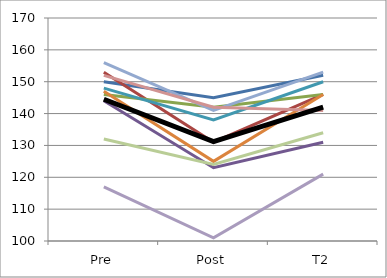
| Category | Series 0 | Series 1 | Series 2 | Series 3 | Series 4 | Series 5 | Series 6 | Series 7 | Series 8 | Series 9 | Mean |
|---|---|---|---|---|---|---|---|---|---|---|---|
| Pre | 150 | 153 | 146 | 144 | 148 | 147 | 156 | 152 | 132 | 117 | 144.5 |
| Post | 145 | 131 | 142 | 123 | 138 | 125 | 141 | 142 | 124 | 101 | 131.2 |
| T2 | 152 | 146 | 146 | 131 | 150 | 146 | 153 | 141 | 134 | 121 | 142 |